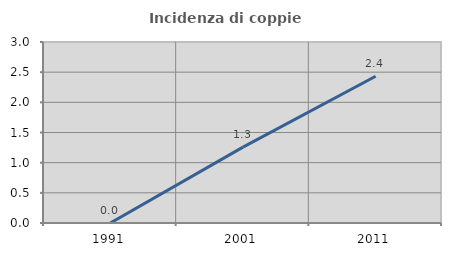
| Category | Incidenza di coppie miste |
|---|---|
| 1991.0 | 0 |
| 2001.0 | 1.258 |
| 2011.0 | 2.432 |